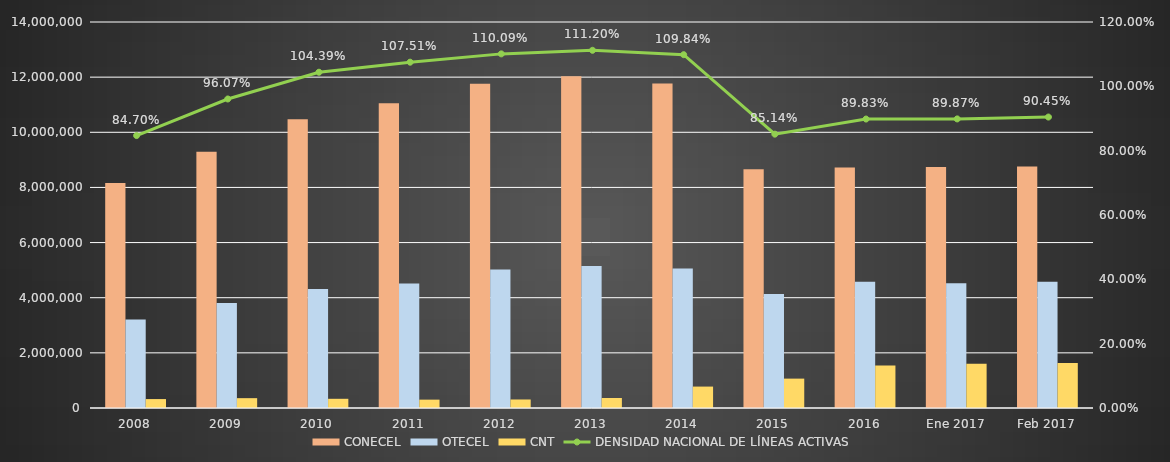
| Category | CONECEL | OTECEL | CNT |
|---|---|---|---|
| 2008 | 8156359 | 3211922 | 323967 |
| 2009 | 9291268 | 3806432 | 356900 |
| 2010 | 10470502 | 4314599 | 333730 |
| 2011 | 11057316 | 4513874 | 303368 |
| 2012 | 11757906 | 5019686 | 309271 |
| 2013 | 12030886 | 5148308 | 362560 |
| 2014 | 11772020 | 5055645 | 776892 |
| 2015 | 8658619 | 4134698 | 1065703 |
| 2016 | 8726823 | 4580092 | 1541219 |
| Ene 2017 | 8740818.931 | 4525750 | 1606657 |
| Feb 2017 | 8756687 | 4578932 | 1633862 |